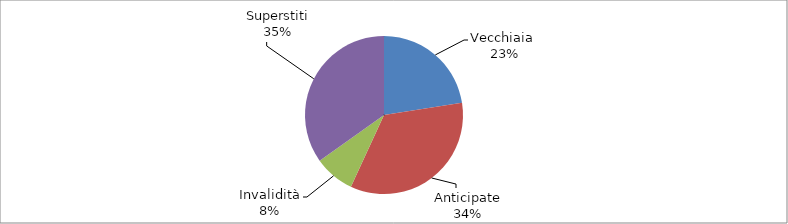
| Category | Series 0 |
|---|---|
| Vecchiaia  | 79752 |
| Anticipate | 121848 |
| Invalidità | 29358 |
| Superstiti | 123493 |